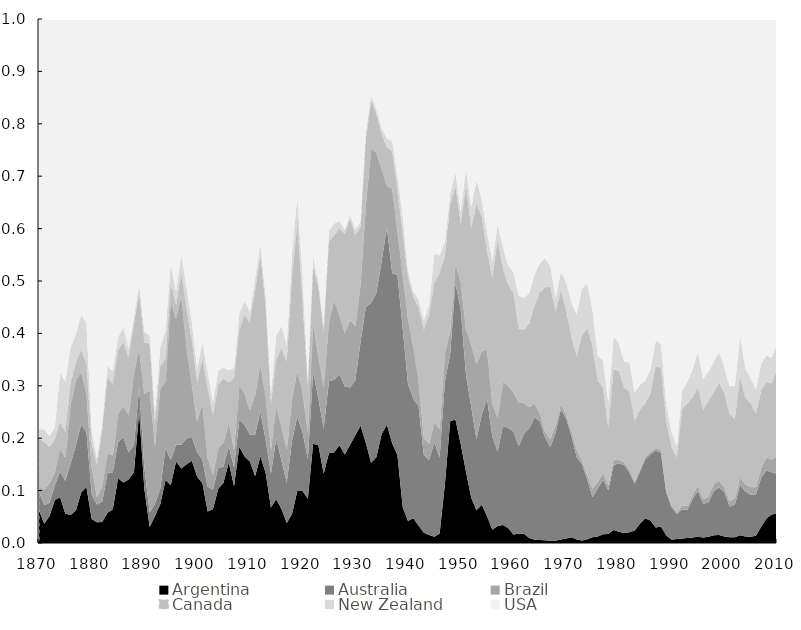
| Category | Argentina | Australia | Brazil | Canada | New Zealand | USA |
|---|---|---|---|---|---|---|
| 1870.0 | 0.062 | 0.036 | 0.01 | 0.09 | 0.018 | 0.783 |
| 1871.0 | 0.037 | 0.035 | 0.03 | 0.09 | 0.025 | 0.783 |
| 1872.0 | 0.052 | 0.025 | 0.038 | 0.068 | 0.021 | 0.796 |
| 1873.0 | 0.082 | 0.028 | 0.025 | 0.063 | 0.023 | 0.779 |
| 1874.0 | 0.087 | 0.049 | 0.044 | 0.051 | 0.095 | 0.674 |
| 1875.0 | 0.056 | 0.062 | 0.044 | 0.049 | 0.097 | 0.692 |
| 1876.0 | 0.054 | 0.098 | 0.113 | 0.04 | 0.068 | 0.627 |
| 1877.0 | 0.062 | 0.124 | 0.125 | 0.033 | 0.055 | 0.601 |
| 1878.0 | 0.096 | 0.13 | 0.1 | 0.042 | 0.066 | 0.565 |
| 1879.0 | 0.107 | 0.105 | 0.074 | 0.056 | 0.078 | 0.58 |
| 1880.0 | 0.046 | 0.047 | 0.052 | 0.043 | 0.026 | 0.786 |
| 1881.0 | 0.039 | 0.034 | 0.014 | 0.06 | 0.012 | 0.84 |
| 1882.0 | 0.04 | 0.039 | 0.029 | 0.11 | 0.011 | 0.771 |
| 1883.0 | 0.058 | 0.077 | 0.037 | 0.146 | 0.021 | 0.661 |
| 1884.0 | 0.064 | 0.071 | 0.032 | 0.135 | 0.026 | 0.672 |
| 1885.0 | 0.124 | 0.068 | 0.054 | 0.122 | 0.025 | 0.607 |
| 1886.0 | 0.116 | 0.087 | 0.059 | 0.122 | 0.028 | 0.589 |
| 1887.0 | 0.121 | 0.052 | 0.072 | 0.108 | 0.018 | 0.629 |
| 1888.0 | 0.134 | 0.052 | 0.139 | 0.092 | 0.014 | 0.569 |
| 1889.0 | 0.249 | 0.047 | 0.074 | 0.104 | 0.018 | 0.507 |
| 1890.0 | 0.102 | 0.041 | 0.141 | 0.099 | 0.02 | 0.597 |
| 1891.0 | 0.03 | 0.028 | 0.234 | 0.089 | 0.016 | 0.604 |
| 1892.0 | 0.052 | 0.023 | 0.112 | 0.04 | 0.023 | 0.75 |
| 1893.0 | 0.074 | 0.029 | 0.192 | 0.042 | 0.037 | 0.626 |
| 1894.0 | 0.12 | 0.061 | 0.127 | 0.043 | 0.053 | 0.596 |
| 1895.0 | 0.11 | 0.048 | 0.302 | 0.034 | 0.039 | 0.466 |
| 1896.0 | 0.156 | 0.032 | 0.24 | 0.026 | 0.026 | 0.52 |
| 1897.0 | 0.142 | 0.045 | 0.285 | 0.042 | 0.036 | 0.449 |
| 1898.0 | 0.15 | 0.049 | 0.175 | 0.071 | 0.042 | 0.513 |
| 1899.0 | 0.157 | 0.045 | 0.101 | 0.083 | 0.034 | 0.579 |
| 1900.0 | 0.126 | 0.047 | 0.06 | 0.073 | 0.027 | 0.667 |
| 1901.0 | 0.114 | 0.045 | 0.108 | 0.085 | 0.032 | 0.616 |
| 1902.0 | 0.06 | 0.047 | 0.054 | 0.133 | 0.031 | 0.674 |
| 1903.0 | 0.064 | 0.038 | 0.029 | 0.111 | 0.026 | 0.731 |
| 1904.0 | 0.104 | 0.039 | 0.038 | 0.121 | 0.027 | 0.671 |
| 1905.0 | 0.115 | 0.031 | 0.046 | 0.122 | 0.021 | 0.665 |
| 1906.0 | 0.154 | 0.031 | 0.045 | 0.076 | 0.024 | 0.67 |
| 1907.0 | 0.108 | 0.036 | 0.035 | 0.136 | 0.019 | 0.666 |
| 1908.0 | 0.184 | 0.052 | 0.065 | 0.105 | 0.032 | 0.562 |
| 1909.0 | 0.165 | 0.06 | 0.06 | 0.149 | 0.028 | 0.538 |
| 1910.0 | 0.156 | 0.051 | 0.047 | 0.167 | 0.019 | 0.56 |
| 1911.0 | 0.127 | 0.08 | 0.075 | 0.2 | 0.023 | 0.495 |
| 1912.0 | 0.166 | 0.085 | 0.091 | 0.206 | 0.023 | 0.429 |
| 1913.0 | 0.134 | 0.063 | 0.084 | 0.17 | 0.02 | 0.53 |
| 1914.0 | 0.068 | 0.065 | 0.046 | 0.085 | 0.022 | 0.714 |
| 1915.0 | 0.084 | 0.115 | 0.061 | 0.09 | 0.047 | 0.603 |
| 1916.0 | 0.065 | 0.093 | 0.066 | 0.148 | 0.043 | 0.586 |
| 1917.0 | 0.038 | 0.077 | 0.064 | 0.166 | 0.033 | 0.622 |
| 1918.0 | 0.055 | 0.14 | 0.08 | 0.23 | 0.048 | 0.446 |
| 1919.0 | 0.099 | 0.142 | 0.087 | 0.282 | 0.05 | 0.339 |
| 1920.0 | 0.099 | 0.111 | 0.079 | 0.169 | 0.05 | 0.491 |
| 1921.0 | 0.084 | 0.076 | 0.05 | 0.086 | 0.01 | 0.693 |
| 1922.0 | 0.189 | 0.137 | 0.095 | 0.103 | 0.02 | 0.454 |
| 1923.0 | 0.187 | 0.089 | 0.081 | 0.131 | 0.011 | 0.501 |
| 1924.0 | 0.133 | 0.086 | 0.08 | 0.103 | 0.012 | 0.586 |
| 1925.0 | 0.171 | 0.137 | 0.113 | 0.153 | 0.022 | 0.404 |
| 1926.0 | 0.173 | 0.138 | 0.152 | 0.123 | 0.023 | 0.39 |
| 1927.0 | 0.187 | 0.135 | 0.113 | 0.166 | 0.013 | 0.386 |
| 1928.0 | 0.169 | 0.131 | 0.102 | 0.188 | 0.008 | 0.402 |
| 1929.0 | 0.187 | 0.11 | 0.129 | 0.192 | 0.008 | 0.374 |
| 1930.0 | 0.206 | 0.105 | 0.104 | 0.174 | 0.011 | 0.401 |
| 1931.0 | 0.224 | 0.16 | 0.11 | 0.11 | 0.009 | 0.388 |
| 1932.0 | 0.191 | 0.259 | 0.194 | 0.127 | 0.009 | 0.219 |
| 1933.0 | 0.153 | 0.305 | 0.294 | 0.092 | 0.009 | 0.147 |
| 1934.0 | 0.163 | 0.314 | 0.269 | 0.073 | 0.009 | 0.172 |
| 1935.0 | 0.208 | 0.33 | 0.176 | 0.067 | 0.011 | 0.208 |
| 1936.0 | 0.226 | 0.376 | 0.08 | 0.073 | 0.018 | 0.228 |
| 1937.0 | 0.191 | 0.324 | 0.161 | 0.07 | 0.02 | 0.234 |
| 1938.0 | 0.167 | 0.343 | 0.085 | 0.076 | 0.029 | 0.299 |
| 1939.0 | 0.068 | 0.341 | 0.103 | 0.077 | 0.033 | 0.377 |
| 1940.0 | 0.042 | 0.262 | 0.125 | 0.077 | 0.015 | 0.48 |
| 1941.0 | 0.047 | 0.228 | 0.1 | 0.094 | 0.011 | 0.521 |
| 1942.0 | 0.033 | 0.227 | 0.049 | 0.14 | 0.016 | 0.534 |
| 1943.0 | 0.019 | 0.148 | 0.033 | 0.206 | 0.018 | 0.575 |
| 1944.0 | 0.015 | 0.143 | 0.031 | 0.245 | 0.021 | 0.546 |
| 1945.0 | 0.012 | 0.181 | 0.038 | 0.267 | 0.055 | 0.448 |
| 1946.0 | 0.018 | 0.145 | 0.054 | 0.298 | 0.034 | 0.451 |
| 1947.0 | 0.113 | 0.196 | 0.054 | 0.185 | 0.028 | 0.425 |
| 1948.0 | 0.232 | 0.128 | 0.042 | 0.243 | 0.022 | 0.333 |
| 1949.0 | 0.236 | 0.26 | 0.037 | 0.148 | 0.027 | 0.292 |
| 1950.0 | 0.189 | 0.257 | 0.052 | 0.109 | 0.027 | 0.366 |
| 1951.0 | 0.137 | 0.185 | 0.087 | 0.271 | 0.035 | 0.286 |
| 1952.0 | 0.087 | 0.173 | 0.119 | 0.223 | 0.039 | 0.359 |
| 1953.0 | 0.062 | 0.135 | 0.145 | 0.305 | 0.045 | 0.308 |
| 1954.0 | 0.073 | 0.173 | 0.12 | 0.256 | 0.032 | 0.346 |
| 1955.0 | 0.051 | 0.224 | 0.094 | 0.188 | 0.036 | 0.407 |
| 1956.0 | 0.025 | 0.178 | 0.064 | 0.237 | 0.033 | 0.462 |
| 1957.0 | 0.033 | 0.142 | 0.064 | 0.338 | 0.031 | 0.392 |
| 1958.0 | 0.034 | 0.189 | 0.086 | 0.214 | 0.043 | 0.435 |
| 1959.0 | 0.029 | 0.191 | 0.08 | 0.193 | 0.037 | 0.47 |
| 1960.0 | 0.016 | 0.197 | 0.074 | 0.19 | 0.039 | 0.484 |
| 1961.0 | 0.018 | 0.167 | 0.085 | 0.139 | 0.064 | 0.528 |
| 1962.0 | 0.018 | 0.191 | 0.058 | 0.14 | 0.061 | 0.532 |
| 1963.0 | 0.01 | 0.209 | 0.041 | 0.159 | 0.058 | 0.523 |
| 1964.0 | 0.006 | 0.234 | 0.026 | 0.188 | 0.059 | 0.488 |
| 1965.0 | 0.006 | 0.226 | 0.015 | 0.231 | 0.055 | 0.466 |
| 1966.0 | 0.005 | 0.196 | 0.012 | 0.275 | 0.055 | 0.457 |
| 1967.0 | 0.004 | 0.179 | 0.015 | 0.29 | 0.04 | 0.472 |
| 1968.0 | 0.004 | 0.206 | 0.015 | 0.216 | 0.027 | 0.532 |
| 1969.0 | 0.007 | 0.249 | 0.009 | 0.217 | 0.036 | 0.482 |
| 1970.0 | 0.008 | 0.229 | 0.009 | 0.199 | 0.053 | 0.502 |
| 1971.0 | 0.011 | 0.194 | 0.009 | 0.178 | 0.066 | 0.542 |
| 1972.0 | 0.007 | 0.157 | 0.013 | 0.179 | 0.08 | 0.564 |
| 1973.0 | 0.005 | 0.146 | 0.008 | 0.238 | 0.09 | 0.515 |
| 1974.0 | 0.007 | 0.114 | 0.009 | 0.28 | 0.085 | 0.505 |
| 1975.0 | 0.011 | 0.076 | 0.017 | 0.271 | 0.07 | 0.556 |
| 1976.0 | 0.013 | 0.091 | 0.013 | 0.192 | 0.048 | 0.643 |
| 1977.0 | 0.017 | 0.104 | 0.013 | 0.163 | 0.052 | 0.651 |
| 1978.0 | 0.017 | 0.083 | 0.01 | 0.107 | 0.051 | 0.732 |
| 1979.0 | 0.025 | 0.124 | 0.01 | 0.172 | 0.063 | 0.606 |
| 1980.0 | 0.021 | 0.131 | 0.007 | 0.169 | 0.053 | 0.619 |
| 1981.0 | 0.019 | 0.13 | 0.006 | 0.141 | 0.05 | 0.654 |
| 1982.0 | 0.02 | 0.114 | 0.005 | 0.149 | 0.056 | 0.655 |
| 1983.0 | 0.024 | 0.089 | 0.005 | 0.115 | 0.055 | 0.712 |
| 1984.0 | 0.037 | 0.1 | 0.005 | 0.114 | 0.048 | 0.698 |
| 1985.0 | 0.047 | 0.113 | 0.005 | 0.102 | 0.043 | 0.691 |
| 1986.0 | 0.043 | 0.127 | 0.005 | 0.111 | 0.046 | 0.669 |
| 1987.0 | 0.03 | 0.147 | 0.005 | 0.156 | 0.049 | 0.614 |
| 1988.0 | 0.031 | 0.141 | 0.006 | 0.157 | 0.045 | 0.621 |
| 1989.0 | 0.014 | 0.082 | 0.005 | 0.13 | 0.033 | 0.736 |
| 1990.0 | 0.006 | 0.062 | 0.004 | 0.11 | 0.029 | 0.788 |
| 1991.0 | 0.007 | 0.048 | 0.004 | 0.103 | 0.023 | 0.815 |
| 1992.0 | 0.009 | 0.056 | 0.007 | 0.184 | 0.035 | 0.71 |
| 1993.0 | 0.009 | 0.053 | 0.008 | 0.196 | 0.042 | 0.692 |
| 1994.0 | 0.011 | 0.073 | 0.009 | 0.186 | 0.054 | 0.668 |
| 1995.0 | 0.012 | 0.087 | 0.01 | 0.187 | 0.068 | 0.635 |
| 1996.0 | 0.01 | 0.064 | 0.009 | 0.169 | 0.059 | 0.687 |
| 1997.0 | 0.012 | 0.065 | 0.011 | 0.182 | 0.057 | 0.672 |
| 1998.0 | 0.015 | 0.084 | 0.014 | 0.174 | 0.058 | 0.654 |
| 1999.0 | 0.015 | 0.091 | 0.013 | 0.187 | 0.059 | 0.635 |
| 2000.0 | 0.012 | 0.085 | 0.009 | 0.18 | 0.05 | 0.664 |
| 2001.0 | 0.011 | 0.059 | 0.011 | 0.166 | 0.054 | 0.7 |
| 2002.0 | 0.011 | 0.062 | 0.012 | 0.151 | 0.063 | 0.7 |
| 2003.0 | 0.015 | 0.096 | 0.015 | 0.19 | 0.08 | 0.605 |
| 2004.0 | 0.012 | 0.086 | 0.014 | 0.164 | 0.056 | 0.667 |
| 2005.0 | 0.012 | 0.08 | 0.015 | 0.16 | 0.048 | 0.685 |
| 2006.0 | 0.014 | 0.078 | 0.014 | 0.141 | 0.046 | 0.707 |
| 2007.0 | 0.031 | 0.093 | 0.018 | 0.148 | 0.052 | 0.658 |
| 2008.0 | 0.047 | 0.092 | 0.026 | 0.143 | 0.051 | 0.642 |
| 2009.0 | 0.054 | 0.08 | 0.025 | 0.144 | 0.049 | 0.647 |
| 2010.0 | 0.056 | 0.076 | 0.033 | 0.167 | 0.049 | 0.619 |